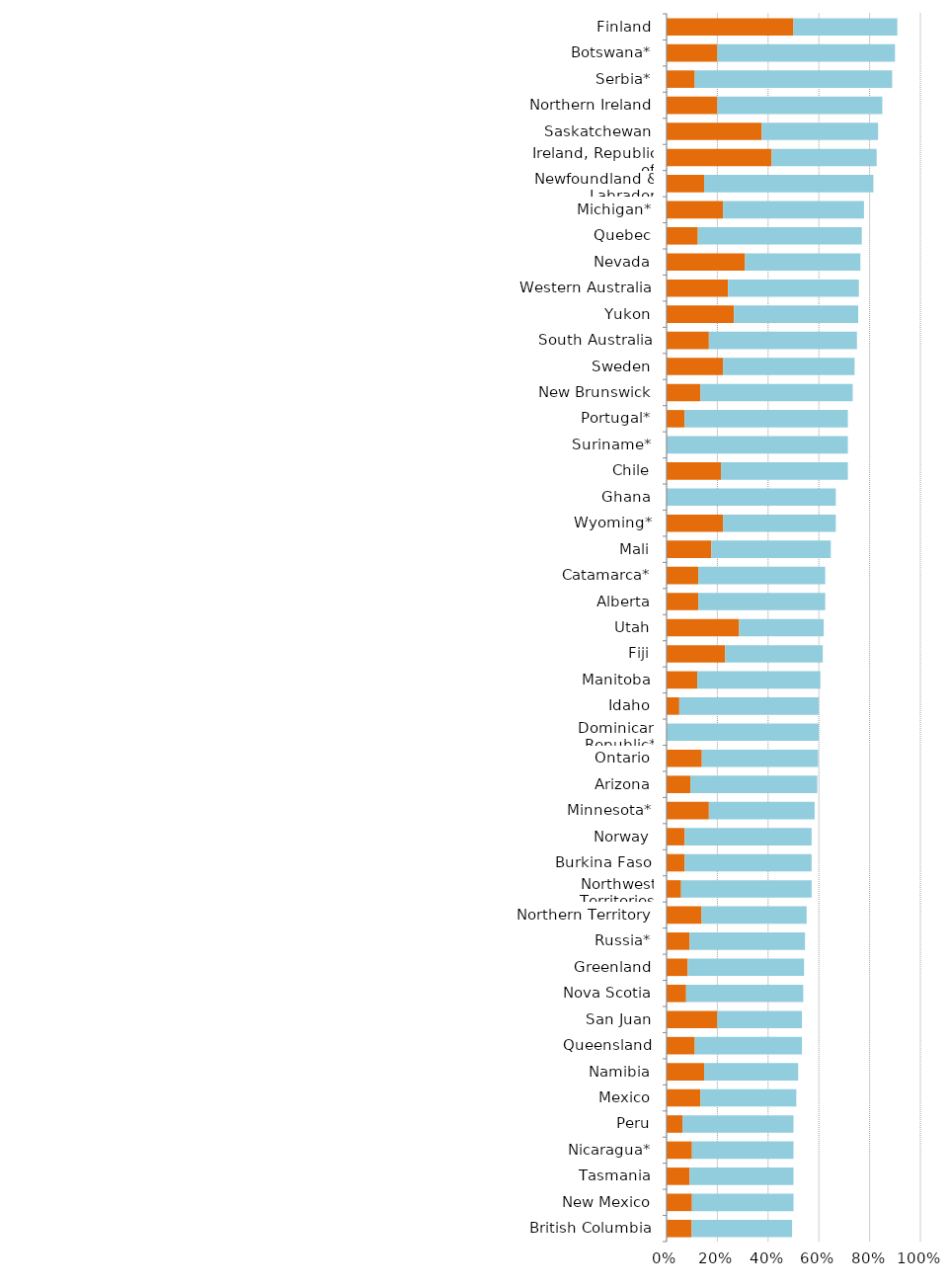
| Category | Series 0 | Series 1 |
|---|---|---|
| British Columbia | 0.099 | 0.396 |
| New Mexico | 0.1 | 0.4 |
| Tasmania | 0.091 | 0.409 |
| Nicaragua* | 0.1 | 0.4 |
| Peru | 0.062 | 0.438 |
| Mexico | 0.133 | 0.378 |
| Namibia | 0.148 | 0.37 |
| Queensland | 0.111 | 0.422 |
| San Juan | 0.2 | 0.333 |
| Nova Scotia | 0.077 | 0.462 |
| Greenland | 0.083 | 0.458 |
| Russia* | 0.091 | 0.455 |
| Northern Territory | 0.138 | 0.414 |
| Northwest Territories | 0.057 | 0.514 |
| Burkina Faso | 0.071 | 0.5 |
| Norway | 0.071 | 0.5 |
| Minnesota* | 0.167 | 0.417 |
| Arizona | 0.094 | 0.5 |
| Ontario | 0.139 | 0.458 |
| Dominican Republic* | 0 | 0.6 |
| Idaho | 0.05 | 0.55 |
| Manitoba | 0.121 | 0.485 |
| Fiji | 0.231 | 0.385 |
| Utah | 0.286 | 0.333 |
| Alberta | 0.125 | 0.5 |
| Catamarca* | 0.125 | 0.5 |
| Mali | 0.176 | 0.471 |
| Wyoming* | 0.222 | 0.444 |
| Ghana | 0 | 0.667 |
| Chile | 0.214 | 0.5 |
| Suriname* | 0 | 0.714 |
| Portugal* | 0.071 | 0.643 |
| New Brunswick | 0.133 | 0.6 |
| Sweden | 0.222 | 0.519 |
| South Australia | 0.167 | 0.583 |
| Yukon | 0.265 | 0.49 |
| Western Australia | 0.242 | 0.515 |
| Nevada | 0.309 | 0.455 |
| Quebec | 0.123 | 0.646 |
| Michigan* | 0.222 | 0.556 |
| Newfoundland & Labrador | 0.148 | 0.667 |
| Ireland, Republic of | 0.414 | 0.414 |
| Saskatchewan | 0.375 | 0.458 |
| Northern Ireland | 0.2 | 0.65 |
| Serbia* | 0.111 | 0.778 |
| Botswana* | 0.2 | 0.7 |
| Finland | 0.5 | 0.409 |